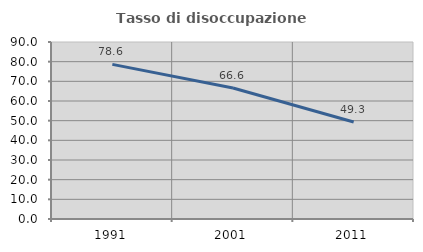
| Category | Tasso di disoccupazione giovanile  |
|---|---|
| 1991.0 | 78.625 |
| 2001.0 | 66.605 |
| 2011.0 | 49.348 |